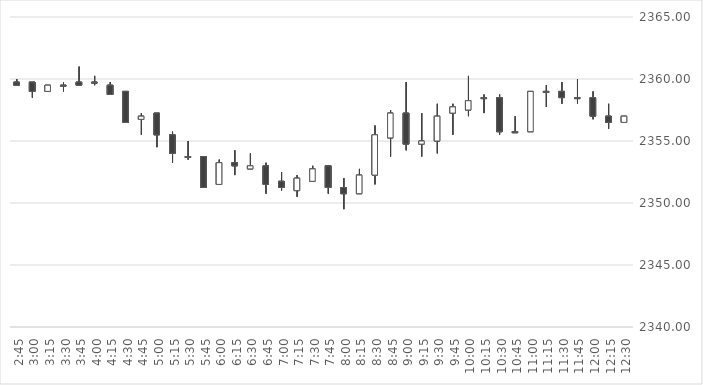
| Category | Series 0 | Series 1 | Series 2 | Series 3 |
|---|---|---|---|---|
| 2017-02-24 12:30:00 | 2356.5 | 2357 | 2356.5 | 2357 |
| 2017-02-24 12:15:00 | 2357 | 2358 | 2356 | 2356.5 |
| 2017-02-24 12:00:00 | 2358.5 | 2359 | 2356.75 | 2357 |
| 2017-02-24 11:45:00 | 2358.5 | 2360 | 2358 | 2358.5 |
| 2017-02-24 11:30:00 | 2359 | 2359.75 | 2358 | 2358.5 |
| 2017-02-24 11:15:00 | 2359 | 2359.5 | 2357.75 | 2359 |
| 2017-02-24 11:00:00 | 2355.75 | 2359 | 2355.75 | 2359 |
| 2017-02-24 10:45:00 | 2355.75 | 2357 | 2355.75 | 2355.75 |
| 2017-02-24 10:30:00 | 2358.5 | 2358.75 | 2355.5 | 2355.75 |
| 2017-02-24 10:15:00 | 2358.5 | 2358.75 | 2357.25 | 2358.5 |
| 2017-02-24 10:00:00 | 2357.5 | 2360.25 | 2357 | 2358.25 |
| 2017-02-24 09:45:00 | 2357.25 | 2358 | 2355.5 | 2357.75 |
| 2017-02-24 09:30:00 | 2355 | 2358 | 2354 | 2357 |
| 2017-02-24 09:15:00 | 2354.75 | 2357.25 | 2353.75 | 2355 |
| 2017-02-24 09:00:00 | 2357.25 | 2359.75 | 2354.25 | 2354.75 |
| 2017-02-24 08:45:00 | 2355.25 | 2357.5 | 2353.75 | 2357.25 |
| 2017-02-24 08:30:00 | 2352.25 | 2356.25 | 2351.5 | 2355.5 |
| 2017-02-24 08:15:00 | 2350.75 | 2352.75 | 2350.75 | 2352.25 |
| 2017-02-24 08:00:00 | 2351.25 | 2352 | 2349.5 | 2350.75 |
| 2017-02-24 07:45:00 | 2353 | 2353 | 2350.75 | 2351.25 |
| 2017-02-24 07:30:00 | 2351.75 | 2353 | 2351.75 | 2352.75 |
| 2017-02-24 07:15:00 | 2351 | 2352.25 | 2350.5 | 2352 |
| 2017-02-24 07:00:00 | 2351.75 | 2352.5 | 2351 | 2351.25 |
| 2017-02-24 06:45:00 | 2353 | 2353.25 | 2350.75 | 2351.5 |
| 2017-02-24 06:30:00 | 2352.75 | 2354 | 2352.75 | 2353 |
| 2017-02-24 06:15:00 | 2353.25 | 2354.25 | 2352.25 | 2353 |
| 2017-02-24 06:00:00 | 2351.5 | 2353.5 | 2351.5 | 2353.25 |
| 2017-02-24 05:45:00 | 2353.75 | 2353.75 | 2351.25 | 2351.25 |
| 2017-02-24 05:30:00 | 2353.75 | 2355 | 2353.5 | 2353.75 |
| 2017-02-24 05:15:00 | 2355.5 | 2355.75 | 2353.25 | 2354 |
| 2017-02-24 05:00:00 | 2357.25 | 2357.25 | 2354.5 | 2355.5 |
| 2017-02-24 04:45:00 | 2356.75 | 2357.25 | 2355.5 | 2357 |
| 2017-02-24 04:30:00 | 2359 | 2359 | 2356.5 | 2356.5 |
| 2017-02-24 04:15:00 | 2359.5 | 2359.75 | 2358.75 | 2358.75 |
| 2017-02-24 04:00:00 | 2359.75 | 2360.25 | 2359.5 | 2359.75 |
| 2017-02-24 03:45:00 | 2359.75 | 2361 | 2359.5 | 2359.5 |
| 2017-02-24 03:30:00 | 2359.5 | 2359.75 | 2359 | 2359.5 |
| 2017-02-24 03:15:00 | 2359 | 2359.5 | 2359 | 2359.5 |
| 2017-02-24 03:00:00 | 2359.75 | 2359.75 | 2358.5 | 2359 |
| 2017-02-24 02:45:00 | 2359.75 | 2360 | 2359.5 | 2359.5 |